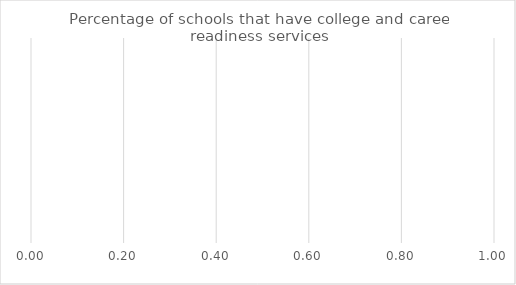
| Category | Benchmark | Entire LEA  | Title IV-A Identified Schools |
|---|---|---|---|
| Percentage of schools that have college and career readiness services | 0 | 0 | 0 |